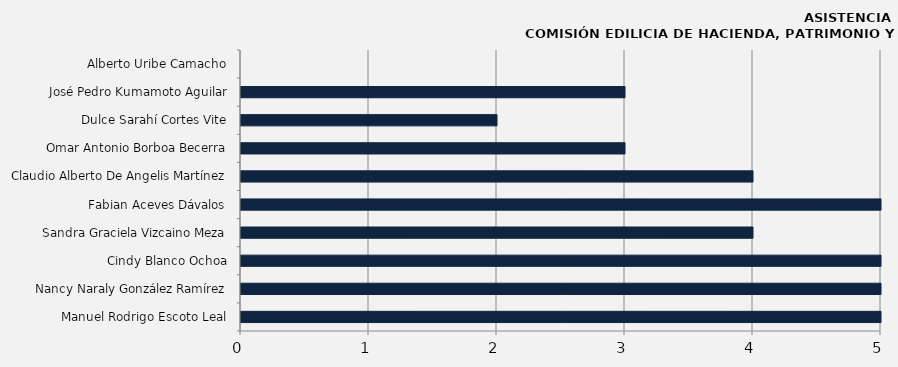
| Category | Manuel Rodrigo Escoto Leal |
|---|---|
| Manuel Rodrigo Escoto Leal | 5 |
| Nancy Naraly González Ramírez | 5 |
| Cindy Blanco Ochoa | 5 |
| Sandra Graciela Vizcaino Meza | 4 |
| Fabian Aceves Dávalos | 5 |
| Claudio Alberto De Angelis Martínez | 4 |
| Omar Antonio Borboa Becerra | 3 |
| Dulce Sarahí Cortes Vite | 2 |
| José Pedro Kumamoto Aguilar | 3 |
| Alberto Uribe Camacho | 0 |